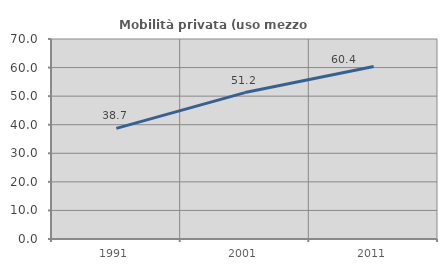
| Category | Mobilità privata (uso mezzo privato) |
|---|---|
| 1991.0 | 38.718 |
| 2001.0 | 51.245 |
| 2011.0 | 60.376 |